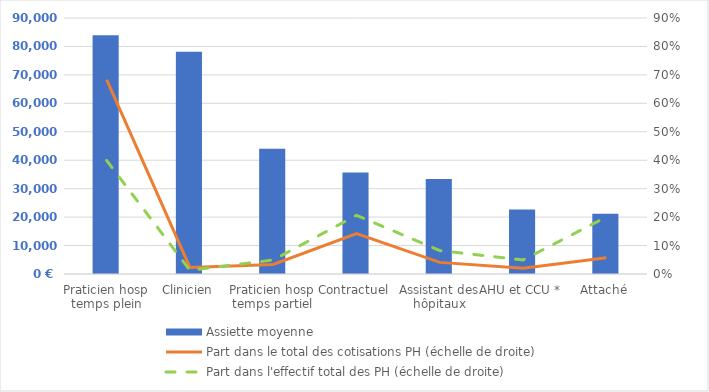
| Category | Assiette moyenne |
|---|---|
| Praticien hosp
temps plein | 83934.338 |
| Clinicien | 78157.842 |
| Praticien hosp
temps partiel | 44022.626 |
| Contractuel | 35666.413 |
| Assistant des hôpitaux | 33433.489 |
| AHU et CCU * | 22710.036 |
| Attaché | 21218.96 |